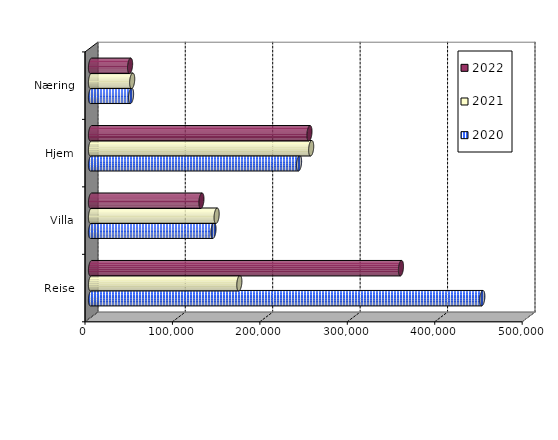
| Category | 2020 | 2021 | 2022 |
|---|---|---|---|
| Reise | 447542 | 169642 | 354485 |
| Villa | 140079.526 | 143670.227 | 126288.325 |
| Hjem | 237964 | 251790 | 249832.072 |
| Næring | 45810.753 | 47091.596 | 44703.942 |